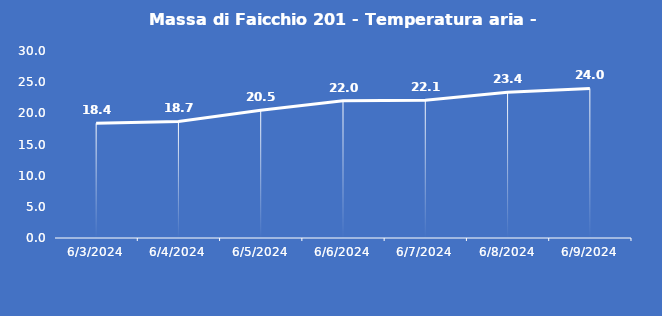
| Category | Massa di Faicchio 201 - Temperatura aria - Grezzo (°C) |
|---|---|
| 6/3/24 | 18.4 |
| 6/4/24 | 18.7 |
| 6/5/24 | 20.5 |
| 6/6/24 | 22 |
| 6/7/24 | 22.1 |
| 6/8/24 | 23.4 |
| 6/9/24 | 24 |